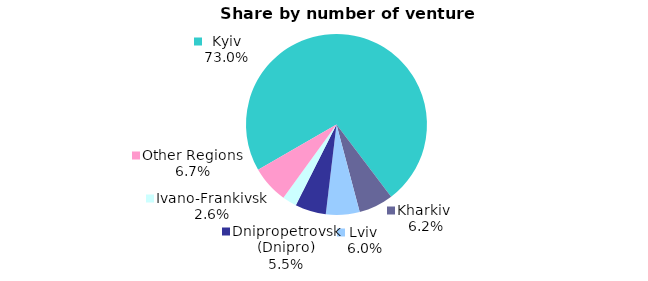
| Category | Series 0 |
|---|---|
| Kyiv | 0.73 |
| Kharkiv  | 0.062 |
| Lviv  | 0.06 |
| Dnipropetrovsk (Dnipro) | 0.055 |
| Ivano-Frankivsk | 0.026 |
| Other Regions | 0.067 |